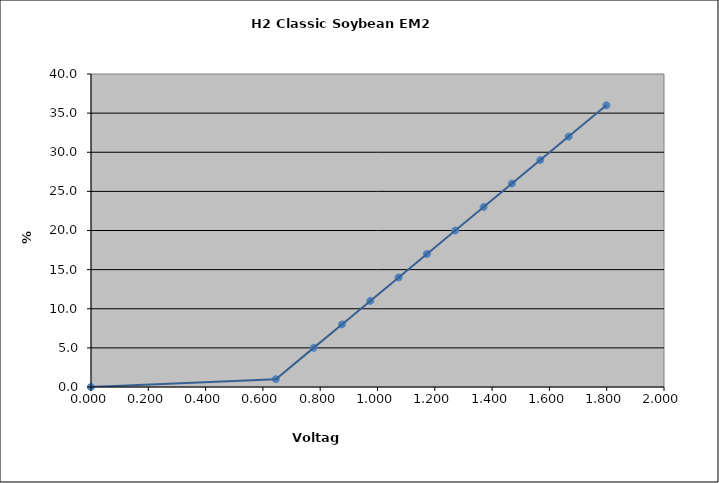
| Category | Generated Curve |
|---|---|
| 0.0 | 0 |
| 0.6451318681318683 | 1 |
| 0.777 | 5 |
| 0.8759010989010989 | 8 |
| 0.9748021978021978 | 11 |
| 1.0737032967032967 | 14 |
| 1.1726043956043957 | 17 |
| 1.2715054945054944 | 20 |
| 1.3704065934065932 | 23 |
| 1.4693076923076922 | 26 |
| 1.568208791208791 | 29 |
| 1.66710989010989 | 32 |
| 1.7989780219780218 | 36 |